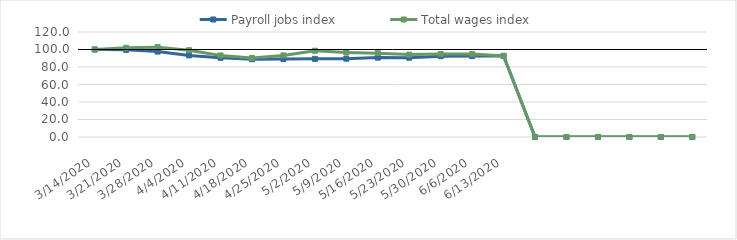
| Category | Payroll jobs index | Total wages index |
|---|---|---|
| 14/03/2020 | 100 | 100 |
| 21/03/2020 | 99.618 | 101.963 |
| 28/03/2020 | 97.581 | 102.712 |
| 04/04/2020 | 93.251 | 99.151 |
| 11/04/2020 | 90.49 | 93.208 |
| 18/04/2020 | 88.898 | 90.322 |
| 25/04/2020 | 89.157 | 93.268 |
| 02/05/2020 | 89.304 | 98.572 |
| 09/05/2020 | 89.513 | 96.63 |
| 16/05/2020 | 90.744 | 95.848 |
| 23/05/2020 | 90.621 | 94.187 |
| 30/05/2020 | 92.345 | 94.916 |
| 06/06/2020 | 92.457 | 94.77 |
| 13/06/2020 | 92.765 | 92.599 |